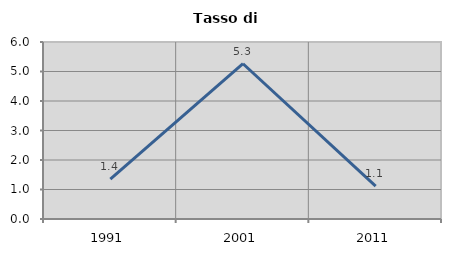
| Category | Tasso di disoccupazione   |
|---|---|
| 1991.0 | 1.351 |
| 2001.0 | 5.263 |
| 2011.0 | 1.111 |